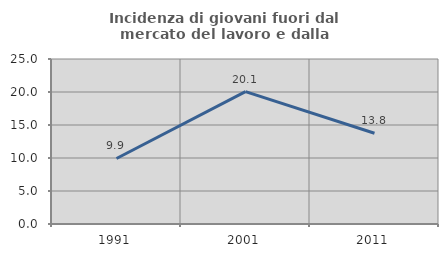
| Category | Incidenza di giovani fuori dal mercato del lavoro e dalla formazione  |
|---|---|
| 1991.0 | 9.929 |
| 2001.0 | 20.063 |
| 2011.0 | 13.75 |